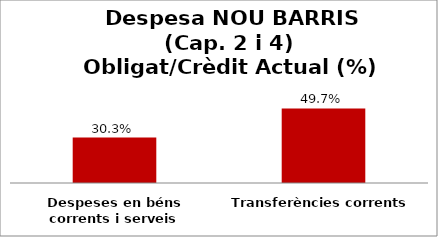
| Category | Series 0 |
|---|---|
| Despeses en béns corrents i serveis | 0.303 |
| Transferències corrents | 0.497 |